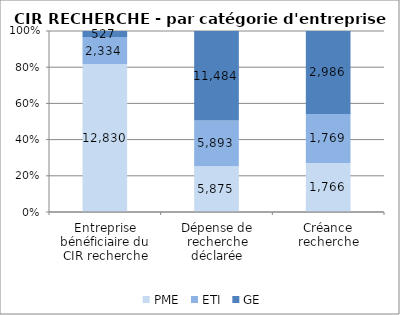
| Category | PME | ETI | GE |
|---|---|---|---|
| Entreprise bénéficiaire du CIR recherche | 12830 | 2334 | 527 |
| Dépense de recherche déclarée | 5874.75 | 5893.36 | 11484.22 |
| Créance recherche | 1766.09 | 1768.98 | 2986.41 |